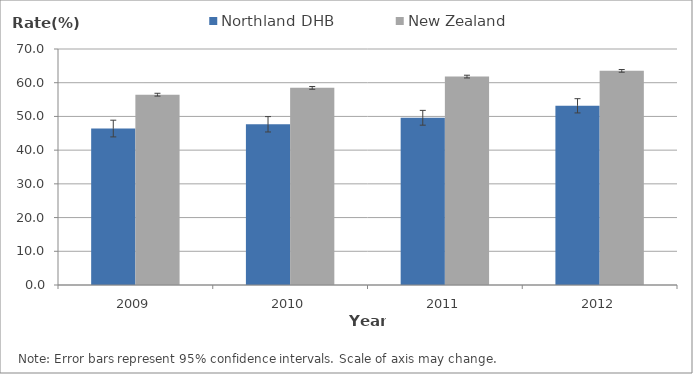
| Category | Northland DHB | New Zealand |
|---|---|---|
| 2009.0 | 46.396 | 56.45 |
| 2010.0 | 47.663 | 58.47 |
| 2011.0 | 49.599 | 61.82 |
| 2012.0 | 53.159 | 63.513 |